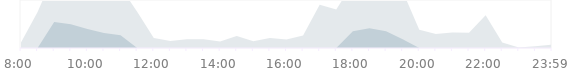
| Category | Управление | Series 1 | Series 2 | Series 3 |
|---|---|---|---|---|
| 0.333333333333333 | 87 | 0 | 0 | 0 |
| nan | 563 | 0 | 0 | 0 |
| nan | 1156 | 406 | 0 | 0 |
| nan | 1123 | 373 | 0 | 0 |
| 0.416666666666667 | 1046 | 296 | 0 | 0 |
| nan | 985 | 235 | 0 | 0 |
| nan | 950 | 200 | 0 | 0 |
| nan | 567 | 0 | 0 | 0 |
| 0.5 | 156 | 0 | 0 | 0 |
| nan | 111 | 0 | 0 | 0 |
| nan | 135 | 0 | 0 | 0 |
| nan | 138 | 0 | 0 | 0 |
| 0.583333333333333 | 103 | 0 | 0 | 0 |
| nan | 188 | 0 | 0 | 0 |
| nan | 106 | 0 | 0 | 0 |
| nan | 157 | 0 | 0 | 0 |
| 0.666666666666667 | 131 | 0 | 0 | 0 |
| nan | 197 | 0 | 0 | 0 |
| nan | 674 | 0 | 0 | 0 |
| nan | 603 | 0 | 0 | 0 |
| 0.75 | 1010 | 260 | 0 | 0 |
| nan | 1058 | 308 | 0 | 0 |
| nan | 1012 | 262 | 0 | 0 |
| nan | 886 | 136 | 0 | 0 |
| 0.833333333333333 | 287 | 0 | 0 | 0 |
| nan | 219 | 0 | 0 | 0 |
| nan | 241 | 0 | 0 | 0 |
| nan | 240 | 0 | 0 | 0 |
| 0.916666666666667 | 512 | 0 | 0 | 0 |
| nan | 85 | 0 | 0 | 0 |
| nan | 6 | 0 | 0 | 0 |
| nan | 27 | 0 | 0 | 0 |
| 0.9993055555555556 | 54 | 0 | 0 | 0 |